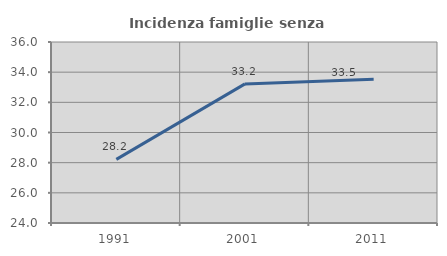
| Category | Incidenza famiglie senza nuclei |
|---|---|
| 1991.0 | 28.217 |
| 2001.0 | 33.221 |
| 2011.0 | 33.536 |